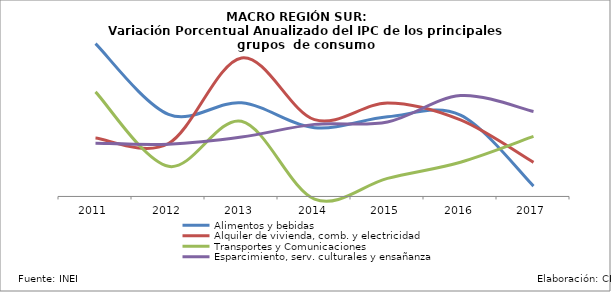
| Category | Alimentos y bebidas | Alquiler de vivienda, comb. y electricidad | Transportes y Comunicaciones | Esparcimiento, serv. culturales y ensañanza |
|---|---|---|---|---|
| 2011.0 | 0.074 | 0.028 | 0.051 | 0.026 |
| 2012.0 | 0.04 | 0.026 | 0.015 | 0.025 |
| 2013.0 | 0.046 | 0.067 | 0.037 | 0.029 |
| 2014.0 | 0.033 | 0.037 | -0.001 | 0.035 |
| 2015.0 | 0.039 | 0.045 | 0.009 | 0.036 |
| 2016.0 | 0.04 | 0.037 | 0.017 | 0.049 |
| 2017.0 | 0.005 | 0.017 | 0.029 | 0.041 |